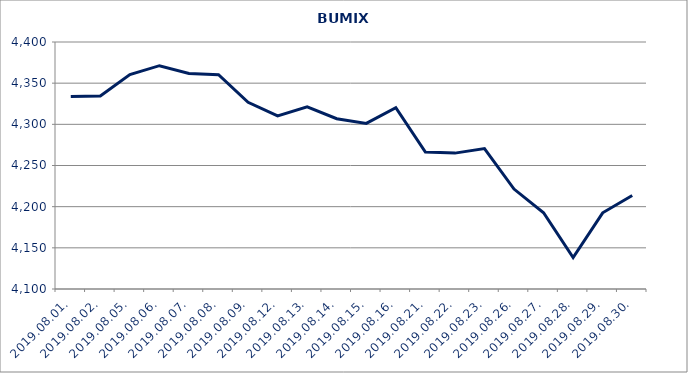
| Category | BUMIX |
|---|---|
| 2019.08.01. | 4333.848 |
| 2019.08.02. | 4334.389 |
| 2019.08.05. | 4360.472 |
| 2019.08.06. | 4371.235 |
| 2019.08.07. | 4361.835 |
| 2019.08.08. | 4360.227 |
| 2019.08.09. | 4326.737 |
| 2019.08.12. | 4310.22 |
| 2019.08.13. | 4321.347 |
| 2019.08.14. | 4306.77 |
| 2019.08.15. | 4301.13 |
| 2019.08.16. | 4320.179 |
| 2019.08.21. | 4266.336 |
| 2019.08.22. | 4265.048 |
| 2019.08.23. | 4270.526 |
| 2019.08.26. | 4221.362 |
| 2019.08.27. | 4192.659 |
| 2019.08.28. | 4138.255 |
| 2019.08.29. | 4192.546 |
| 2019.08.30. | 4213.507 |